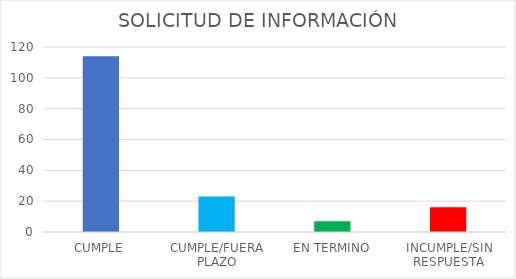
| Category | TOTAL |
|---|---|
| CUMPLE | 114 |
| CUMPLE/FUERA PLAZO | 23 |
| EN TERMINO | 7 |
| INCUMPLE/SIN RESPUESTA | 16 |